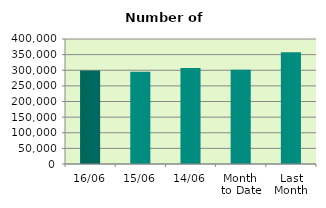
| Category | Series 0 |
|---|---|
| 16/06 | 298814 |
| 15/06 | 295022 |
| 14/06 | 307212 |
| Month 
to Date | 301986.167 |
| Last
Month | 357760.286 |